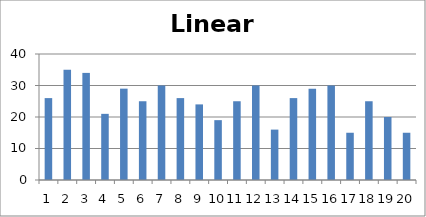
| Category | Linear |
|---|---|
| 0 | 26 |
| 1 | 35 |
| 2 | 34 |
| 3 | 21 |
| 4 | 29 |
| 5 | 25 |
| 6 | 30 |
| 7 | 26 |
| 8 | 24 |
| 9 | 19 |
| 10 | 25 |
| 11 | 30 |
| 12 | 16 |
| 13 | 26 |
| 14 | 29 |
| 15 | 30 |
| 16 | 15 |
| 17 | 25 |
| 18 | 20 |
| 19 | 15 |